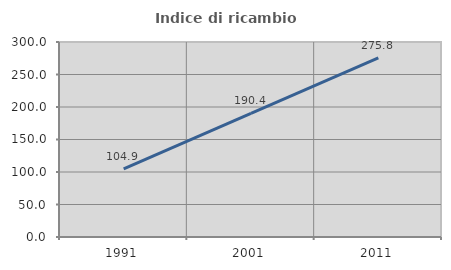
| Category | Indice di ricambio occupazionale  |
|---|---|
| 1991.0 | 104.938 |
| 2001.0 | 190.361 |
| 2011.0 | 275.758 |